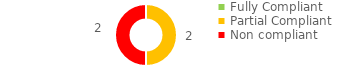
| Category | Series 0 |
|---|---|
| Fully Compliant | 0 |
| Partial Compliant | 2 |
| Non compliant | 2 |